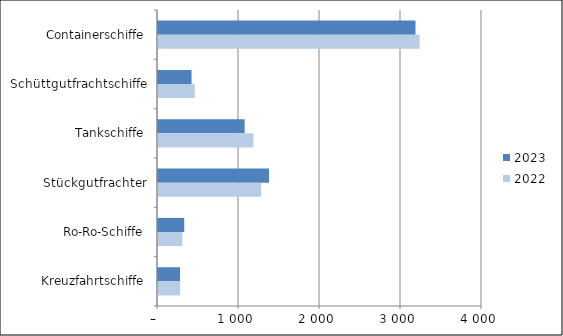
| Category | 2023 | 2022 |
|---|---|---|
| Containerschiffe | 3179 | 3230 |
| Schüttgutfrachtschiffe | 414 | 454 |
| Tankschiffe | 1070 | 1178 |
| Stückgutfrachter | 1371 | 1274 |
| Ro-Ro-Schiffe | 324 | 300 |
| Kreuzfahrtschiffe | 272 | 274 |